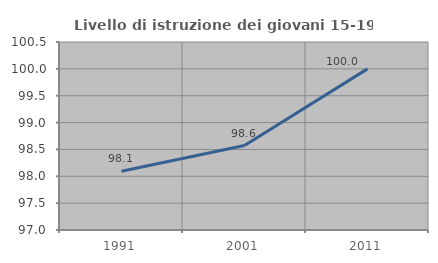
| Category | Livello di istruzione dei giovani 15-19 anni |
|---|---|
| 1991.0 | 98.095 |
| 2001.0 | 98.571 |
| 2011.0 | 100 |